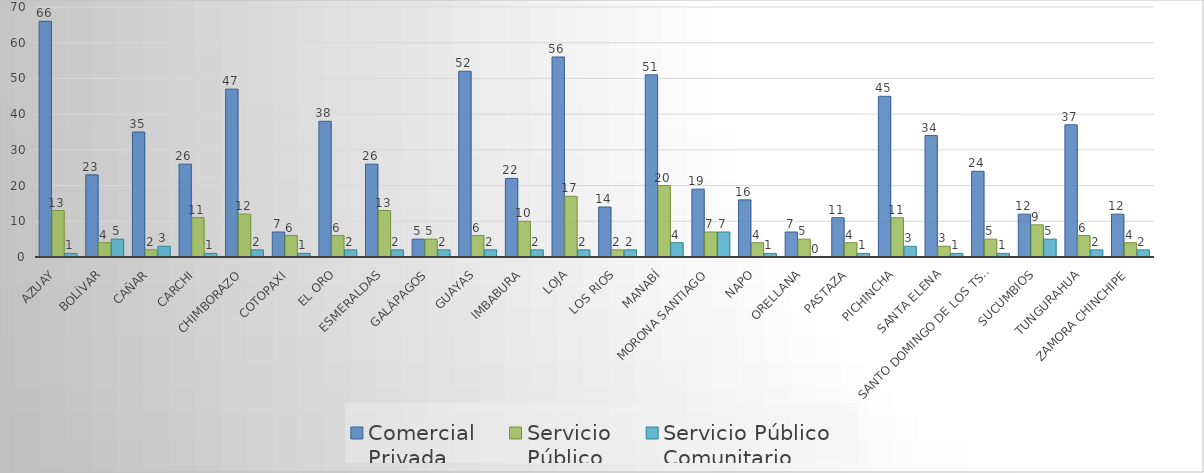
| Category | Comercial 
Privada | Servicio 
Público | Servicio Público
Comunitario |
|---|---|---|---|
| Azuay | 66 | 13 | 1 |
| Bolívar | 23 | 4 | 5 |
| Cañar | 35 | 2 | 3 |
| Carchi | 26 | 11 | 1 |
| Chimborazo | 47 | 12 | 2 |
| Cotopaxi | 7 | 6 | 1 |
| El Oro | 38 | 6 | 2 |
| Esmeraldas | 26 | 13 | 2 |
| Galápagos | 5 | 5 | 2 |
| Guayas | 52 | 6 | 2 |
| Imbabura | 22 | 10 | 2 |
| Loja | 56 | 17 | 2 |
| Los Rios | 14 | 2 | 2 |
| Manabí | 51 | 20 | 4 |
| Morona Santiago | 19 | 7 | 7 |
| Napo | 16 | 4 | 1 |
| Orellana | 7 | 5 | 0 |
| Pastaza | 11 | 4 | 1 |
| Pichincha | 45 | 11 | 3 |
| Santa Elena | 34 | 3 | 1 |
| Santo Domingo de los Tsáchilas | 24 | 5 | 1 |
| Sucumbios | 12 | 9 | 5 |
| Tungurahua | 37 | 6 | 2 |
| Zamora Chinchipe | 12 | 4 | 2 |